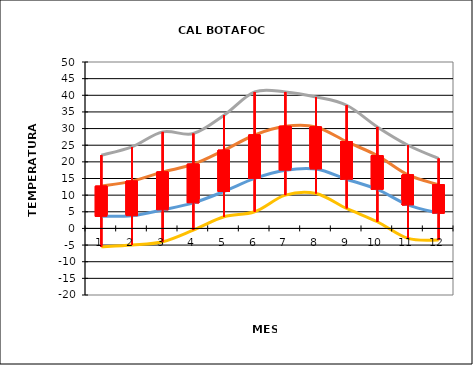
| Category | Series 1 | Series 2 | Series 3 | Series 4 |
|---|---|---|---|---|
| 0 | 12.683 | 22 | -5.5 | 3.637 |
| 1 | 14.207 | 24.5 | -5 | 3.83 |
| 2 | 16.943 | 29 | -4 | 5.59 |
| 3 | 19.297 | 28.5 | -0.5 | 7.683 |
| 4 | 23.487 | 34 | 3.5 | 11.1 |
| 5 | 28.073 | 41 | 5 | 15.027 |
| 6 | 30.673 | 41 | 10 | 17.49 |
| 7 | 30.477 | 39.5 | 10.5 | 17.837 |
| 8 | 26.057 | 37 | 6 | 14.77 |
| 9 | 21.87 | 30.5 | 2 | 11.747 |
| 10 | 16.073 | 25 | -3 | 7.06 |
| 11 | 13.117 | 21 | -3.5 | 4.593 |